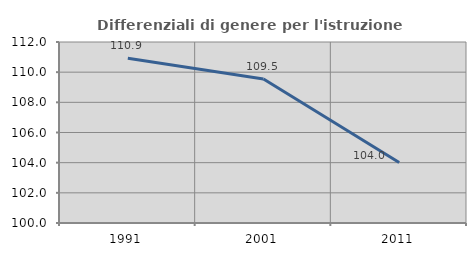
| Category | Differenziali di genere per l'istruzione superiore |
|---|---|
| 1991.0 | 110.917 |
| 2001.0 | 109.546 |
| 2011.0 | 104.01 |